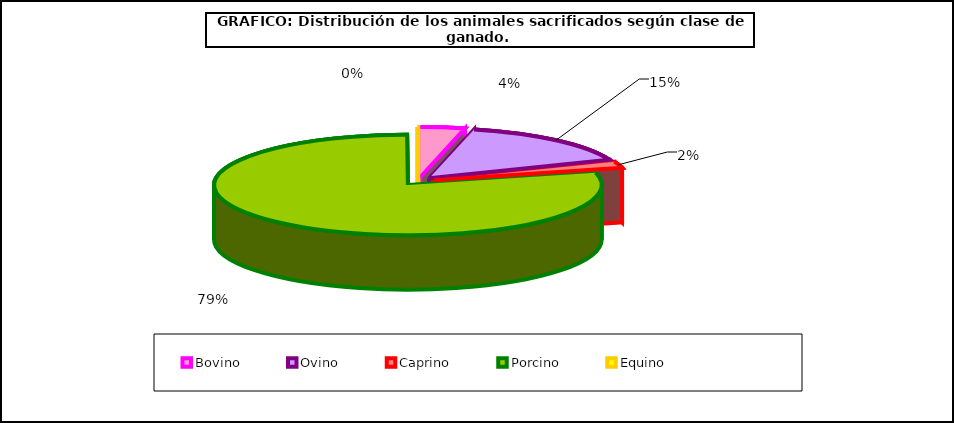
| Category | Series 0 |
|---|---|
| 0 | 2462557 |
| 1 | 10105707 |
| 2 | 1371026 |
| 3 | 52289200 |
| 4 | 41597 |